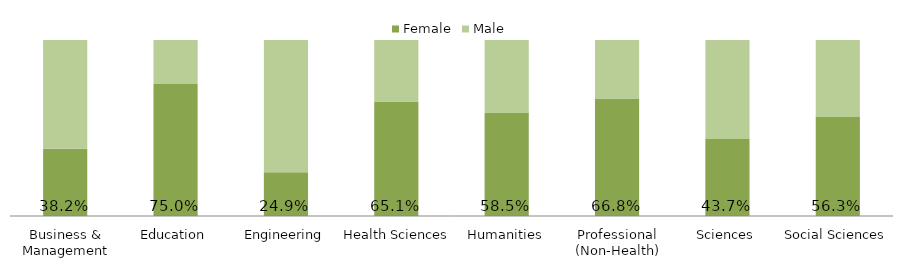
| Category | Female | Male |
|---|---|---|
| Business & Management | 0.382 | 0.618 |
| Education | 0.75 | 0.25 |
| Engineering | 0.249 | 0.751 |
| Health Sciences | 0.651 | 0.349 |
| Humanities | 0.585 | 0.415 |
| Professional (Non-Health) | 0.668 | 0.332 |
| Sciences | 0.437 | 0.563 |
| Social Sciences | 0.563 | 0.437 |